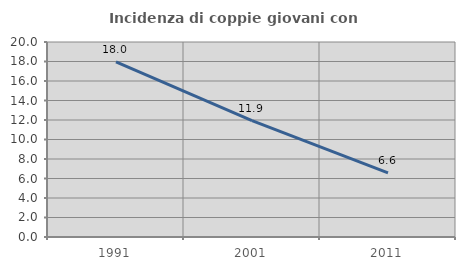
| Category | Incidenza di coppie giovani con figli |
|---|---|
| 1991.0 | 17.957 |
| 2001.0 | 11.938 |
| 2011.0 | 6.57 |